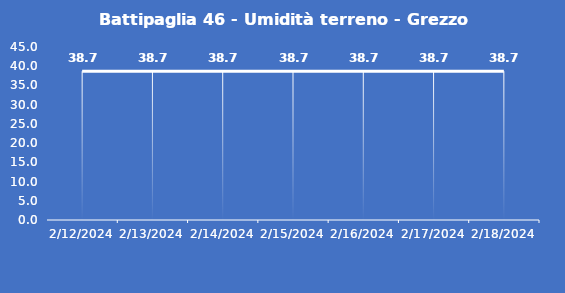
| Category | Battipaglia 46 - Umidità terreno - Grezzo (%VWC) |
|---|---|
| 2/12/24 | 38.7 |
| 2/13/24 | 38.7 |
| 2/14/24 | 38.7 |
| 2/15/24 | 38.7 |
| 2/16/24 | 38.7 |
| 2/17/24 | 38.7 |
| 2/18/24 | 38.7 |